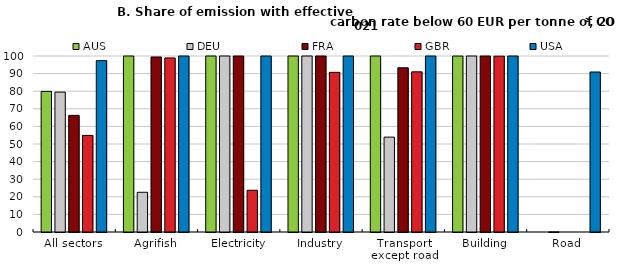
| Category | AUS | DEU | FRA | GBR | USA |
|---|---|---|---|---|---|
| All sectors | 79.893 | 79.467 | 66.26 | 54.884 | 97.351 |
| Agrifish | 100 | 22.574 | 99.442 | 98.902 | 100 |
| Electricity | 100 | 100 | 100 | 23.711 | 100 |
| Industry | 100 | 100 | 100 | 90.722 | 100 |
| Transport except road | 100 | 53.903 | 93.3 | 90.992 | 100 |
| Building | 99.973 | 100 | 100 | 99.895 | 100 |
| Road | 0 | 0.049 | 0 | 0 | 90.905 |